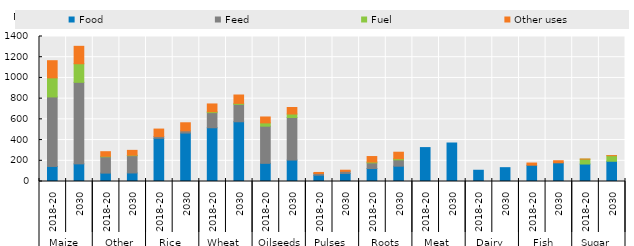
| Category | Food | Feed | Fuel | Other uses |
|---|---|---|---|---|
| 0 | 145372.218 | 671024.424 | 184330.964 | 165527.389 |
| 1 | 170346.065 | 787207.625 | 179485.664 | 168085.811 |
| 2 | 80937.66 | 157435.475 | 5156.763 | 44230.624 |
| 3 | 82413.328 | 167009.513 | 4565.563 | 46667.255 |
| 4 | 417421.516 | 17592.599 | 0 | 71276.261 |
| 5 | 467563.596 | 21659.156 | 0 | 77761.998 |
| 6 | 518904.791 | 146032.613 | 8685.447 | 75108.392 |
| 7 | 576818.888 | 167699.118 | 9828.925 | 80751.598 |
| 8 | 175308.161 | 358725.696 | 31851.286 | 57058.564 |
| 9 | 206804.245 | 411383.657 | 33359.983 | 63060.796 |
| 10 | 60681.979 | 16851.359 | 0 | 9803.152 |
| 11 | 77710.725 | 20524.943 | 0 | 10713.602 |
| 12 | 125437.604 | 54306.172 | 8210.362 | 53076.672 |
| 13 | 147838.533 | 60984.014 | 11048.439 | 62860.06 |
| 14 | 327386.572 | 0 | 0 | 0 |
| 15 | 371675.549 | 0 | 0 | 0 |
| 16 | 108564.953 | 0 | 0 | 0 |
| 17 | 133539.766 | 0 | 0 | 0 |
| 18 | 157269.016 | 0 | 0 | 20992.611 |
| 19 | 180503.69 | 0 | 0 | 20056.191 |
| 20 | 168619.807 | 0 | 47507.359 | 345.617 |
| 21 | 195479.964 | 0 | 53666.807 | 442.592 |